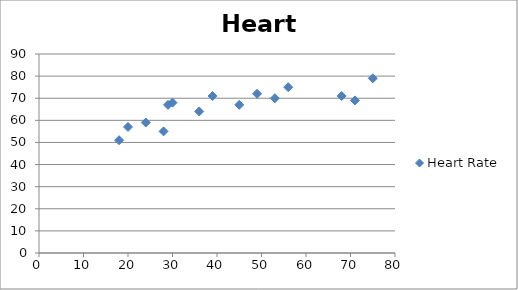
| Category | Heart Rate |
|---|---|
| 18.0 | 51 |
| 20.0 | 57 |
| 24.0 | 59 |
| 28.0 | 55 |
| 29.0 | 67 |
| 30.0 | 68 |
| 36.0 | 64 |
| 39.0 | 71 |
| 45.0 | 67 |
| 49.0 | 72 |
| 53.0 | 70 |
| 56.0 | 75 |
| 68.0 | 71 |
| 71.0 | 69 |
| 75.0 | 79 |